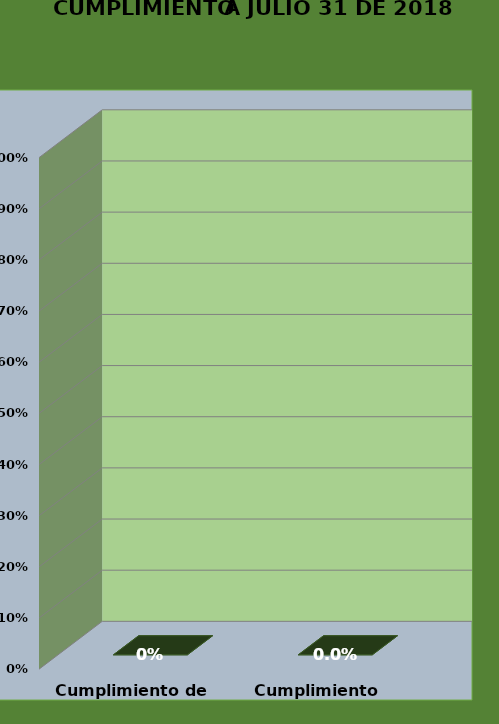
| Category | 31-jul.-18 |
|---|---|
| Cumplimiento de Hitos | 0 |
| Cumplimiento Temporal | 0 |